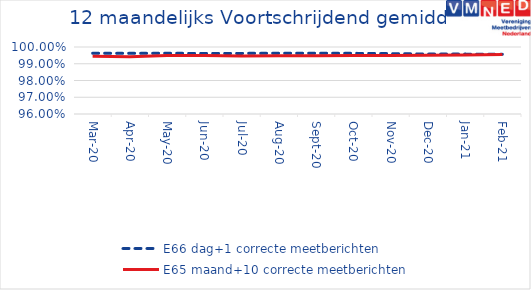
| Category | E66 dag+1 correcte meetberichten | E65 maand+10 correcte meetberichten |
|---|---|---|
| 2020-03-01 | 0.996 | 0.994 |
| 2020-04-01 | 0.996 | 0.994 |
| 2020-05-01 | 0.996 | 0.995 |
| 2020-06-01 | 0.996 | 0.995 |
| 2020-07-01 | 0.996 | 0.995 |
| 2020-08-01 | 0.996 | 0.995 |
| 2020-09-01 | 0.996 | 0.995 |
| 2020-10-01 | 0.996 | 0.995 |
| 2020-11-01 | 0.996 | 0.995 |
| 2020-12-01 | 0.996 | 0.995 |
| 2021-01-01 | 0.996 | 0.995 |
| 2021-02-01 | 0.996 | 0.995 |